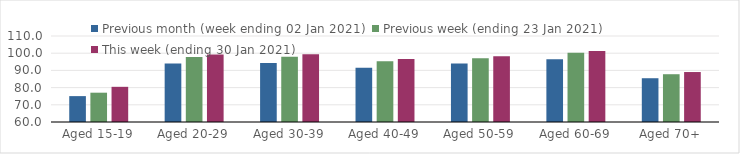
| Category | Previous month (week ending 02 Jan 2021) | Previous week (ending 23 Jan 2021) | This week (ending 30 Jan 2021) |
|---|---|---|---|
| Aged 15-19 | 75.05 | 77.04 | 80.45 |
| Aged 20-29 | 94.02 | 97.83 | 99.28 |
| Aged 30-39 | 94.3 | 97.99 | 99.44 |
| Aged 40-49 | 91.52 | 95.37 | 96.59 |
| Aged 50-59 | 93.95 | 97.08 | 98.17 |
| Aged 60-69 | 96.46 | 100.31 | 101.25 |
| Aged 70+ | 85.45 | 87.78 | 89.05 |